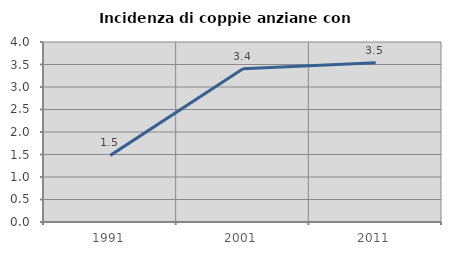
| Category | Incidenza di coppie anziane con figli |
|---|---|
| 1991.0 | 1.48 |
| 2001.0 | 3.403 |
| 2011.0 | 3.536 |